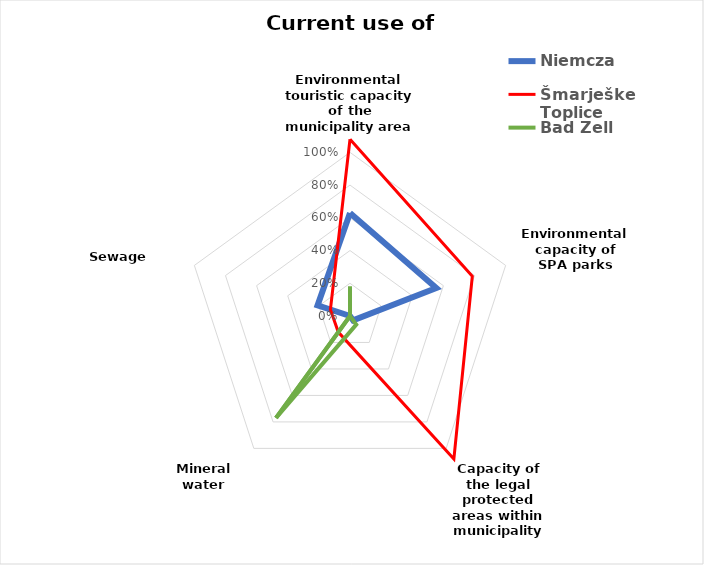
| Category | Niemcza | Šmarješke Toplice | Bad Zell |
|---|---|---|---|
| Environmental touristic capacity of the municipality area | 0.63 | 1.08 | 0.18 |
| Environmental capacity of SPA parks | 0.554 | 0.786 | 0 |
| Capacity of the legal protected areas within municipality borders | 0.032 | 1.08 | 0.065 |
| Mineral water quantity | 0 | 0.122 | 0.769 |
| Sewage quantity | 0.209 | 0.126 | 0 |